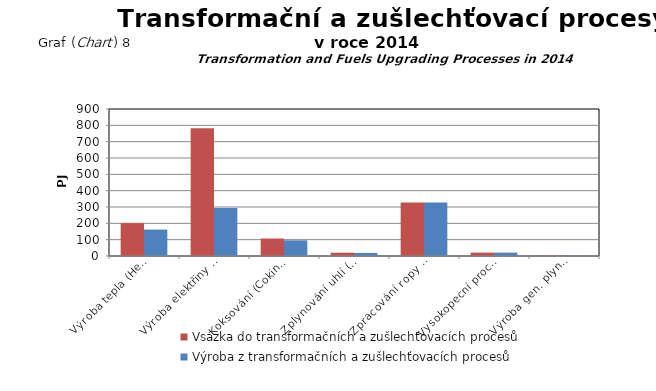
| Category | Vsázka do transformačních a zušlechťovacích procesů | Výroba z transformačních a zušlechťovacích procesů |
|---|---|---|
| Výroba tepla (Heat Production) | 201.102 | 161.696 |
| Výroba elektřiny (Electricity Production) | 781.423 | 293.378 |
| Koksování (Coking Plants) | 106.991 | 95.91 |
| Zplynování uhlí (Gasificat.of Coal) | 20.21 | 18.818 |
| Zpracování ropy (Liquid Fuels Prod.) | 328.191 | 327.992 |
| Vysokopecní proc. (Blast Furnaces) | 20.712 | 20.712 |
| Výroba gen. plynu a energoplynu (Generat. Stations) | 2.997 | 2.456 |